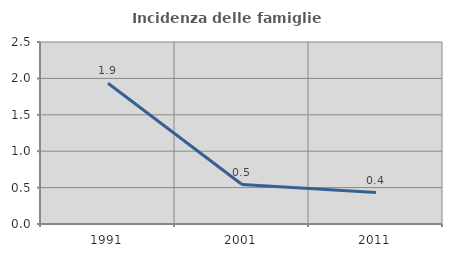
| Category | Incidenza delle famiglie numerose |
|---|---|
| 1991.0 | 1.933 |
| 2001.0 | 0.542 |
| 2011.0 | 0.433 |